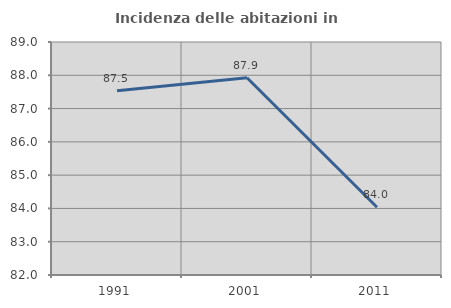
| Category | Incidenza delle abitazioni in proprietà  |
|---|---|
| 1991.0 | 87.539 |
| 2001.0 | 87.926 |
| 2011.0 | 84.036 |